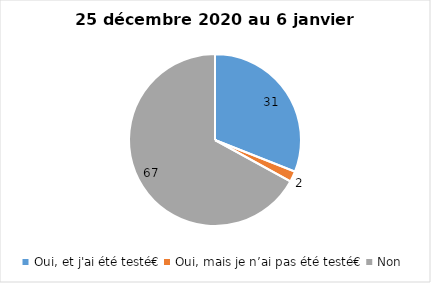
| Category | Series 0 |
|---|---|
| Oui, et j'ai été testé€ | 31 |
| Oui, mais je n’ai pas été testé€ | 2 |
| Non | 67 |